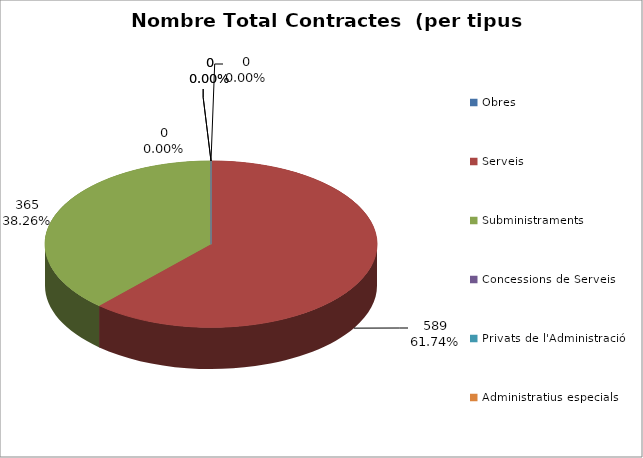
| Category | Nombre Total Contractes |
|---|---|
| Obres | 0 |
| Serveis | 589 |
| Subministraments | 365 |
| Concessions de Serveis | 0 |
| Privats de l'Administració | 0 |
| Administratius especials | 0 |